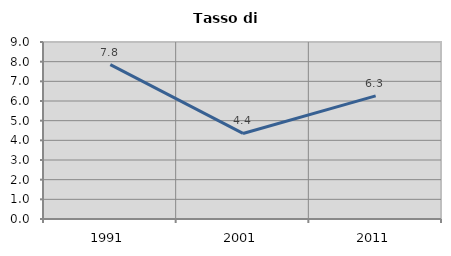
| Category | Tasso di disoccupazione   |
|---|---|
| 1991.0 | 7.846 |
| 2001.0 | 4.35 |
| 2011.0 | 6.26 |